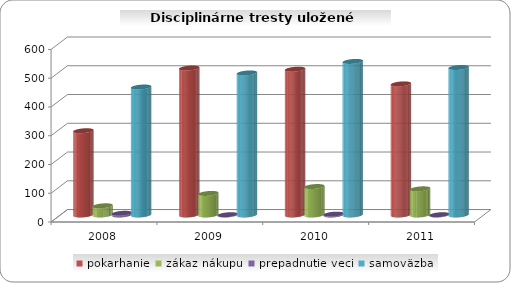
| Category | pokarhanie | zákaz nákupu | prepadnutie veci | samoväzba |
|---|---|---|---|---|
| 2008.0 | 293 | 32 | 6 | 445 |
| 2009.0 | 511 | 75 | 1 | 494 |
| 2010.0 | 507 | 99 | 3 | 534 |
| 2011.0 | 456 | 91 | 1 | 513 |